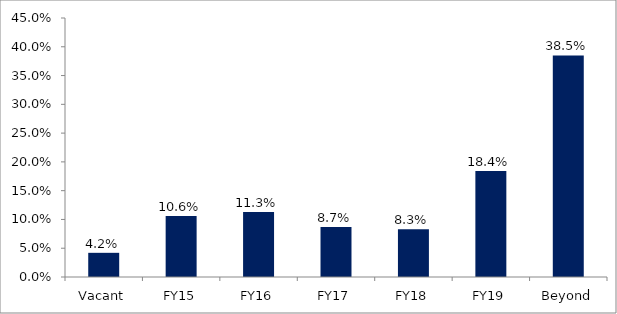
| Category | Series 0 |
|---|---|
| Vacant | 0.042 |
| FY15 | 0.106 |
| FY16 | 0.113 |
| FY17 | 0.087 |
| FY18 | 0.083 |
| FY19 | 0.184 |
| Beyond | 0.385 |